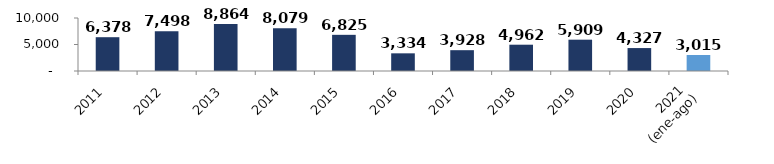
| Category | Series 0 |
|---|---|
| 2011 | 6377.615 |
| 2012 | 7498.207 |
| 2013 | 8863.622 |
| 2014 | 8079.21 |
| 2015 | 6824.624 |
| 2016 | 3333.564 |
| 2017 | 3928.017 |
| 2018 | 4961.838 |
| 2019 | 5908.679 |
| 2020 | 4327.23 |
| 2021 
(ene-ago) | 3015.155 |